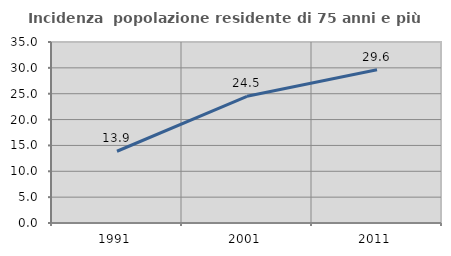
| Category | Incidenza  popolazione residente di 75 anni e più |
|---|---|
| 1991.0 | 13.875 |
| 2001.0 | 24.494 |
| 2011.0 | 29.63 |